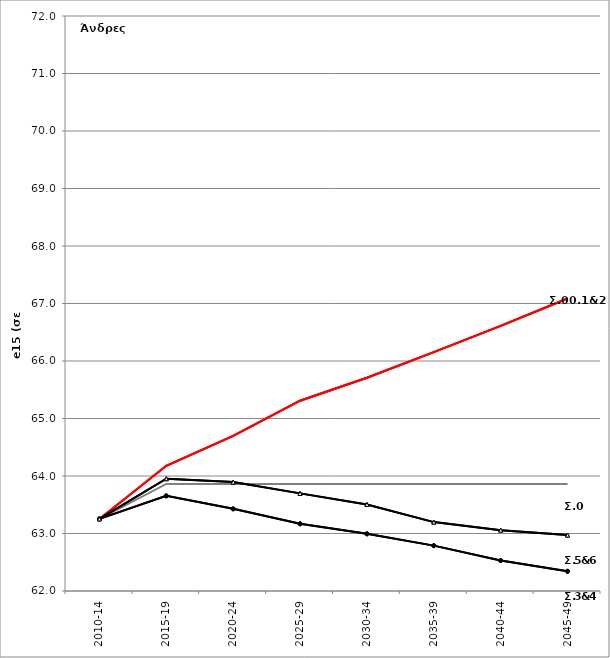
| Category | Σ0.e15 | Σ00.e15 | Σ1.e15 | Σ2.e15 | Σ3.e15 | Σ4.e15 | Σ5.e15 | Σ6.e15 |
|---|---|---|---|---|---|---|---|---|
| 2010-14 | 63.254 | 63.254 | 63.254 | 63.254 | 63.254 | 63.254 | 63.254 | 63.254 |
| 2015-19 | 63.861 | 64.177 | 64.177 | 64.177 | 63.654 | 63.654 | 63.952 | 63.952 |
| 2020-24 | 63.861 | 64.699 | 64.699 | 64.699 | 63.429 | 63.429 | 63.894 | 63.894 |
| 2025-29 | 63.861 | 65.31 | 65.31 | 65.31 | 63.169 | 63.169 | 63.698 | 63.698 |
| 2030-34 | 63.861 | 65.71 | 65.71 | 65.71 | 62.995 | 62.995 | 63.505 | 63.505 |
| 2035-39 | 63.861 | 66.154 | 66.154 | 66.154 | 62.789 | 62.789 | 63.198 | 63.198 |
| 2040-44 | 63.861 | 66.61 | 66.61 | 66.61 | 62.53 | 62.53 | 63.059 | 63.059 |
| 2045-49 | 63.861 | 67.087 | 67.087 | 67.087 | 62.343 | 62.343 | 62.972 | 62.972 |